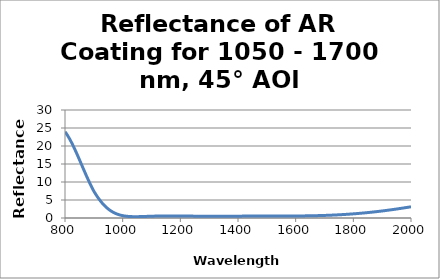
| Category | Reflectance (%) |
|---|---|
| 800.0 | 23.957 |
| 801.0 | 23.852 |
| 802.0 | 23.744 |
| 803.0 | 23.633 |
| 804.0 | 23.52 |
| 805.0 | 23.404 |
| 806.0 | 23.285 |
| 807.0 | 23.164 |
| 808.0 | 23.04 |
| 809.0 | 22.913 |
| 810.0 | 22.784 |
| 811.0 | 22.653 |
| 812.0 | 22.52 |
| 813.0 | 22.384 |
| 814.0 | 22.246 |
| 815.0 | 22.106 |
| 816.0 | 21.963 |
| 817.0 | 21.819 |
| 818.0 | 21.672 |
| 819.0 | 21.524 |
| 820.0 | 21.373 |
| 821.0 | 21.221 |
| 822.0 | 21.067 |
| 823.0 | 20.911 |
| 824.0 | 20.753 |
| 825.0 | 20.594 |
| 826.0 | 20.433 |
| 827.0 | 20.27 |
| 828.0 | 20.106 |
| 829.0 | 19.941 |
| 830.0 | 19.774 |
| 831.0 | 19.605 |
| 832.0 | 19.436 |
| 833.0 | 19.265 |
| 834.0 | 19.092 |
| 835.0 | 18.919 |
| 836.0 | 18.744 |
| 837.0 | 18.569 |
| 838.0 | 18.392 |
| 839.0 | 18.215 |
| 840.0 | 18.036 |
| 841.0 | 17.857 |
| 842.0 | 17.676 |
| 843.0 | 17.495 |
| 844.0 | 17.314 |
| 845.0 | 17.131 |
| 846.0 | 16.948 |
| 847.0 | 16.765 |
| 848.0 | 16.58 |
| 849.0 | 16.396 |
| 850.0 | 16.211 |
| 851.0 | 16.026 |
| 852.0 | 15.84 |
| 853.0 | 15.654 |
| 854.0 | 15.468 |
| 855.0 | 15.282 |
| 856.0 | 15.095 |
| 857.0 | 14.908 |
| 858.0 | 14.722 |
| 859.0 | 14.536 |
| 860.0 | 14.349 |
| 861.0 | 14.163 |
| 862.0 | 13.977 |
| 863.0 | 13.791 |
| 864.0 | 13.605 |
| 865.0 | 13.42 |
| 866.0 | 13.235 |
| 867.0 | 13.05 |
| 868.0 | 12.866 |
| 869.0 | 12.683 |
| 870.0 | 12.5 |
| 871.0 | 12.317 |
| 872.0 | 12.136 |
| 873.0 | 11.954 |
| 874.0 | 11.774 |
| 875.0 | 11.594 |
| 876.0 | 11.415 |
| 877.0 | 11.237 |
| 878.0 | 11.06 |
| 879.0 | 10.884 |
| 880.0 | 10.709 |
| 881.0 | 10.534 |
| 882.0 | 10.361 |
| 883.0 | 10.189 |
| 884.0 | 10.018 |
| 885.0 | 9.848 |
| 886.0 | 9.679 |
| 887.0 | 9.512 |
| 888.0 | 9.345 |
| 889.0 | 9.18 |
| 890.0 | 9.016 |
| 891.0 | 8.854 |
| 892.0 | 8.693 |
| 893.0 | 8.533 |
| 894.0 | 8.375 |
| 895.0 | 8.218 |
| 896.0 | 8.062 |
| 897.0 | 7.908 |
| 898.0 | 7.756 |
| 899.0 | 7.605 |
| 900.0 | 7.456 |
| 901.0 | 7.322 |
| 902.0 | 7.19 |
| 903.0 | 7.058 |
| 904.0 | 6.929 |
| 905.0 | 6.801 |
| 906.0 | 6.674 |
| 907.0 | 6.548 |
| 908.0 | 6.424 |
| 909.0 | 6.301 |
| 910.0 | 6.18 |
| 911.0 | 6.06 |
| 912.0 | 5.941 |
| 913.0 | 5.824 |
| 914.0 | 5.708 |
| 915.0 | 5.594 |
| 916.0 | 5.481 |
| 917.0 | 5.37 |
| 918.0 | 5.26 |
| 919.0 | 5.152 |
| 920.0 | 5.045 |
| 921.0 | 4.939 |
| 922.0 | 4.835 |
| 923.0 | 4.732 |
| 924.0 | 4.631 |
| 925.0 | 4.532 |
| 926.0 | 4.434 |
| 927.0 | 4.337 |
| 928.0 | 4.242 |
| 929.0 | 4.148 |
| 930.0 | 4.055 |
| 931.0 | 3.964 |
| 932.0 | 3.875 |
| 933.0 | 3.787 |
| 934.0 | 3.7 |
| 935.0 | 3.615 |
| 936.0 | 3.532 |
| 937.0 | 3.449 |
| 938.0 | 3.368 |
| 939.0 | 3.289 |
| 940.0 | 3.211 |
| 941.0 | 3.134 |
| 942.0 | 3.059 |
| 943.0 | 2.985 |
| 944.0 | 2.913 |
| 945.0 | 2.842 |
| 946.0 | 2.772 |
| 947.0 | 2.703 |
| 948.0 | 2.636 |
| 949.0 | 2.57 |
| 950.0 | 2.506 |
| 951.0 | 2.442 |
| 952.0 | 2.38 |
| 953.0 | 2.32 |
| 954.0 | 2.26 |
| 955.0 | 2.202 |
| 956.0 | 2.145 |
| 957.0 | 2.09 |
| 958.0 | 2.035 |
| 959.0 | 1.982 |
| 960.0 | 1.93 |
| 961.0 | 1.879 |
| 962.0 | 1.829 |
| 963.0 | 1.78 |
| 964.0 | 1.733 |
| 965.0 | 1.686 |
| 966.0 | 1.641 |
| 967.0 | 1.597 |
| 968.0 | 1.554 |
| 969.0 | 1.512 |
| 970.0 | 1.471 |
| 971.0 | 1.43 |
| 972.0 | 1.392 |
| 973.0 | 1.354 |
| 974.0 | 1.317 |
| 975.0 | 1.28 |
| 976.0 | 1.245 |
| 977.0 | 1.211 |
| 978.0 | 1.178 |
| 979.0 | 1.146 |
| 980.0 | 1.114 |
| 981.0 | 1.084 |
| 982.0 | 1.054 |
| 983.0 | 1.026 |
| 984.0 | 0.998 |
| 985.0 | 0.97 |
| 986.0 | 0.944 |
| 987.0 | 0.919 |
| 988.0 | 0.894 |
| 989.0 | 0.87 |
| 990.0 | 0.847 |
| 991.0 | 0.824 |
| 992.0 | 0.803 |
| 993.0 | 0.782 |
| 994.0 | 0.761 |
| 995.0 | 0.742 |
| 996.0 | 0.723 |
| 997.0 | 0.704 |
| 998.0 | 0.687 |
| 999.0 | 0.67 |
| 1000.0 | 0.653 |
| 1001.0 | 0.638 |
| 1002.0 | 0.622 |
| 1003.0 | 0.608 |
| 1004.0 | 0.594 |
| 1005.0 | 0.58 |
| 1006.0 | 0.567 |
| 1007.0 | 0.555 |
| 1008.0 | 0.543 |
| 1009.0 | 0.532 |
| 1010.0 | 0.521 |
| 1011.0 | 0.51 |
| 1012.0 | 0.5 |
| 1013.0 | 0.491 |
| 1014.0 | 0.482 |
| 1015.0 | 0.473 |
| 1016.0 | 0.465 |
| 1017.0 | 0.457 |
| 1018.0 | 0.45 |
| 1019.0 | 0.443 |
| 1020.0 | 0.436 |
| 1021.0 | 0.43 |
| 1022.0 | 0.425 |
| 1023.0 | 0.419 |
| 1024.0 | 0.414 |
| 1025.0 | 0.409 |
| 1026.0 | 0.405 |
| 1027.0 | 0.401 |
| 1028.0 | 0.397 |
| 1029.0 | 0.393 |
| 1030.0 | 0.39 |
| 1031.0 | 0.387 |
| 1032.0 | 0.384 |
| 1033.0 | 0.382 |
| 1034.0 | 0.38 |
| 1035.0 | 0.378 |
| 1036.0 | 0.376 |
| 1037.0 | 0.375 |
| 1038.0 | 0.374 |
| 1039.0 | 0.373 |
| 1040.0 | 0.372 |
| 1041.0 | 0.371 |
| 1042.0 | 0.371 |
| 1043.0 | 0.37 |
| 1044.0 | 0.37 |
| 1045.0 | 0.371 |
| 1046.0 | 0.371 |
| 1047.0 | 0.371 |
| 1048.0 | 0.372 |
| 1049.0 | 0.373 |
| 1050.0 | 0.374 |
| 1051.0 | 0.375 |
| 1052.0 | 0.376 |
| 1053.0 | 0.377 |
| 1054.0 | 0.378 |
| 1055.0 | 0.38 |
| 1056.0 | 0.381 |
| 1057.0 | 0.383 |
| 1058.0 | 0.385 |
| 1059.0 | 0.387 |
| 1060.0 | 0.389 |
| 1061.0 | 0.391 |
| 1062.0 | 0.393 |
| 1063.0 | 0.395 |
| 1064.0 | 0.397 |
| 1065.0 | 0.4 |
| 1066.0 | 0.402 |
| 1067.0 | 0.405 |
| 1068.0 | 0.407 |
| 1069.0 | 0.41 |
| 1070.0 | 0.412 |
| 1071.0 | 0.415 |
| 1072.0 | 0.417 |
| 1073.0 | 0.42 |
| 1074.0 | 0.423 |
| 1075.0 | 0.426 |
| 1076.0 | 0.428 |
| 1077.0 | 0.431 |
| 1078.0 | 0.434 |
| 1079.0 | 0.437 |
| 1080.0 | 0.44 |
| 1081.0 | 0.442 |
| 1082.0 | 0.445 |
| 1083.0 | 0.448 |
| 1084.0 | 0.451 |
| 1085.0 | 0.454 |
| 1086.0 | 0.457 |
| 1087.0 | 0.459 |
| 1088.0 | 0.462 |
| 1089.0 | 0.465 |
| 1090.0 | 0.468 |
| 1091.0 | 0.471 |
| 1092.0 | 0.473 |
| 1093.0 | 0.476 |
| 1094.0 | 0.479 |
| 1095.0 | 0.482 |
| 1096.0 | 0.484 |
| 1097.0 | 0.487 |
| 1098.0 | 0.49 |
| 1099.0 | 0.492 |
| 1100.0 | 0.495 |
| 1101.0 | 0.497 |
| 1102.0 | 0.5 |
| 1103.0 | 0.502 |
| 1104.0 | 0.505 |
| 1105.0 | 0.507 |
| 1106.0 | 0.51 |
| 1107.0 | 0.512 |
| 1108.0 | 0.514 |
| 1109.0 | 0.517 |
| 1110.0 | 0.519 |
| 1111.0 | 0.521 |
| 1112.0 | 0.523 |
| 1113.0 | 0.525 |
| 1114.0 | 0.528 |
| 1115.0 | 0.53 |
| 1116.0 | 0.532 |
| 1117.0 | 0.534 |
| 1118.0 | 0.535 |
| 1119.0 | 0.537 |
| 1120.0 | 0.539 |
| 1121.0 | 0.541 |
| 1122.0 | 0.543 |
| 1123.0 | 0.544 |
| 1124.0 | 0.546 |
| 1125.0 | 0.548 |
| 1126.0 | 0.549 |
| 1127.0 | 0.551 |
| 1128.0 | 0.552 |
| 1129.0 | 0.554 |
| 1130.0 | 0.555 |
| 1131.0 | 0.556 |
| 1132.0 | 0.558 |
| 1133.0 | 0.559 |
| 1134.0 | 0.56 |
| 1135.0 | 0.561 |
| 1136.0 | 0.562 |
| 1137.0 | 0.564 |
| 1138.0 | 0.564 |
| 1139.0 | 0.566 |
| 1140.0 | 0.566 |
| 1141.0 | 0.567 |
| 1142.0 | 0.568 |
| 1143.0 | 0.569 |
| 1144.0 | 0.57 |
| 1145.0 | 0.57 |
| 1146.0 | 0.571 |
| 1147.0 | 0.572 |
| 1148.0 | 0.572 |
| 1149.0 | 0.573 |
| 1150.0 | 0.574 |
| 1151.0 | 0.574 |
| 1152.0 | 0.574 |
| 1153.0 | 0.575 |
| 1154.0 | 0.575 |
| 1155.0 | 0.576 |
| 1156.0 | 0.576 |
| 1157.0 | 0.576 |
| 1158.0 | 0.576 |
| 1159.0 | 0.577 |
| 1160.0 | 0.577 |
| 1161.0 | 0.577 |
| 1162.0 | 0.577 |
| 1163.0 | 0.577 |
| 1164.0 | 0.577 |
| 1165.0 | 0.577 |
| 1166.0 | 0.577 |
| 1167.0 | 0.577 |
| 1168.0 | 0.577 |
| 1169.0 | 0.577 |
| 1170.0 | 0.576 |
| 1171.0 | 0.576 |
| 1172.0 | 0.576 |
| 1173.0 | 0.576 |
| 1174.0 | 0.576 |
| 1175.0 | 0.575 |
| 1176.0 | 0.575 |
| 1177.0 | 0.574 |
| 1178.0 | 0.574 |
| 1179.0 | 0.574 |
| 1180.0 | 0.573 |
| 1181.0 | 0.573 |
| 1182.0 | 0.572 |
| 1183.0 | 0.572 |
| 1184.0 | 0.571 |
| 1185.0 | 0.571 |
| 1186.0 | 0.57 |
| 1187.0 | 0.57 |
| 1188.0 | 0.569 |
| 1189.0 | 0.568 |
| 1190.0 | 0.568 |
| 1191.0 | 0.567 |
| 1192.0 | 0.566 |
| 1193.0 | 0.566 |
| 1194.0 | 0.565 |
| 1195.0 | 0.564 |
| 1196.0 | 0.564 |
| 1197.0 | 0.563 |
| 1198.0 | 0.562 |
| 1199.0 | 0.561 |
| 1200.0 | 0.56 |
| 1201.0 | 0.56 |
| 1202.0 | 0.559 |
| 1203.0 | 0.558 |
| 1204.0 | 0.557 |
| 1205.0 | 0.556 |
| 1206.0 | 0.556 |
| 1207.0 | 0.555 |
| 1208.0 | 0.554 |
| 1209.0 | 0.553 |
| 1210.0 | 0.552 |
| 1211.0 | 0.551 |
| 1212.0 | 0.55 |
| 1213.0 | 0.549 |
| 1214.0 | 0.548 |
| 1215.0 | 0.548 |
| 1216.0 | 0.547 |
| 1217.0 | 0.546 |
| 1218.0 | 0.545 |
| 1219.0 | 0.544 |
| 1220.0 | 0.543 |
| 1221.0 | 0.542 |
| 1222.0 | 0.541 |
| 1223.0 | 0.54 |
| 1224.0 | 0.539 |
| 1225.0 | 0.538 |
| 1226.0 | 0.538 |
| 1227.0 | 0.537 |
| 1228.0 | 0.536 |
| 1229.0 | 0.535 |
| 1230.0 | 0.534 |
| 1231.0 | 0.533 |
| 1232.0 | 0.532 |
| 1233.0 | 0.531 |
| 1234.0 | 0.53 |
| 1235.0 | 0.529 |
| 1236.0 | 0.528 |
| 1237.0 | 0.528 |
| 1238.0 | 0.527 |
| 1239.0 | 0.526 |
| 1240.0 | 0.525 |
| 1241.0 | 0.524 |
| 1242.0 | 0.523 |
| 1243.0 | 0.522 |
| 1244.0 | 0.522 |
| 1245.0 | 0.521 |
| 1246.0 | 0.52 |
| 1247.0 | 0.519 |
| 1248.0 | 0.518 |
| 1249.0 | 0.518 |
| 1250.0 | 0.517 |
| 1251.0 | 0.516 |
| 1252.0 | 0.515 |
| 1253.0 | 0.514 |
| 1254.0 | 0.514 |
| 1255.0 | 0.513 |
| 1256.0 | 0.512 |
| 1257.0 | 0.511 |
| 1258.0 | 0.511 |
| 1259.0 | 0.51 |
| 1260.0 | 0.509 |
| 1261.0 | 0.509 |
| 1262.0 | 0.508 |
| 1263.0 | 0.507 |
| 1264.0 | 0.507 |
| 1265.0 | 0.506 |
| 1266.0 | 0.505 |
| 1267.0 | 0.505 |
| 1268.0 | 0.504 |
| 1269.0 | 0.503 |
| 1270.0 | 0.503 |
| 1271.0 | 0.502 |
| 1272.0 | 0.502 |
| 1273.0 | 0.501 |
| 1274.0 | 0.501 |
| 1275.0 | 0.5 |
| 1276.0 | 0.5 |
| 1277.0 | 0.499 |
| 1278.0 | 0.499 |
| 1279.0 | 0.498 |
| 1280.0 | 0.498 |
| 1281.0 | 0.497 |
| 1282.0 | 0.497 |
| 1283.0 | 0.497 |
| 1284.0 | 0.496 |
| 1285.0 | 0.496 |
| 1286.0 | 0.495 |
| 1287.0 | 0.495 |
| 1288.0 | 0.495 |
| 1289.0 | 0.494 |
| 1290.0 | 0.494 |
| 1291.0 | 0.494 |
| 1292.0 | 0.494 |
| 1293.0 | 0.493 |
| 1294.0 | 0.493 |
| 1295.0 | 0.493 |
| 1296.0 | 0.492 |
| 1297.0 | 0.492 |
| 1298.0 | 0.492 |
| 1299.0 | 0.492 |
| 1300.0 | 0.492 |
| 1301.0 | 0.492 |
| 1302.0 | 0.491 |
| 1303.0 | 0.491 |
| 1304.0 | 0.491 |
| 1305.0 | 0.491 |
| 1306.0 | 0.491 |
| 1307.0 | 0.491 |
| 1308.0 | 0.491 |
| 1309.0 | 0.491 |
| 1310.0 | 0.491 |
| 1311.0 | 0.491 |
| 1312.0 | 0.491 |
| 1313.0 | 0.491 |
| 1314.0 | 0.491 |
| 1315.0 | 0.491 |
| 1316.0 | 0.491 |
| 1317.0 | 0.491 |
| 1318.0 | 0.491 |
| 1319.0 | 0.491 |
| 1320.0 | 0.491 |
| 1321.0 | 0.491 |
| 1322.0 | 0.491 |
| 1323.0 | 0.492 |
| 1324.0 | 0.492 |
| 1325.0 | 0.492 |
| 1326.0 | 0.492 |
| 1327.0 | 0.492 |
| 1328.0 | 0.492 |
| 1329.0 | 0.492 |
| 1330.0 | 0.492 |
| 1331.0 | 0.493 |
| 1332.0 | 0.493 |
| 1333.0 | 0.493 |
| 1334.0 | 0.493 |
| 1335.0 | 0.493 |
| 1336.0 | 0.494 |
| 1337.0 | 0.494 |
| 1338.0 | 0.494 |
| 1339.0 | 0.494 |
| 1340.0 | 0.494 |
| 1341.0 | 0.495 |
| 1342.0 | 0.495 |
| 1343.0 | 0.495 |
| 1344.0 | 0.495 |
| 1345.0 | 0.496 |
| 1346.0 | 0.496 |
| 1347.0 | 0.496 |
| 1348.0 | 0.496 |
| 1349.0 | 0.497 |
| 1350.0 | 0.497 |
| 1351.0 | 0.497 |
| 1352.0 | 0.498 |
| 1353.0 | 0.498 |
| 1354.0 | 0.498 |
| 1355.0 | 0.499 |
| 1356.0 | 0.499 |
| 1357.0 | 0.499 |
| 1358.0 | 0.5 |
| 1359.0 | 0.5 |
| 1360.0 | 0.5 |
| 1361.0 | 0.501 |
| 1362.0 | 0.501 |
| 1363.0 | 0.501 |
| 1364.0 | 0.502 |
| 1365.0 | 0.502 |
| 1366.0 | 0.502 |
| 1367.0 | 0.503 |
| 1368.0 | 0.503 |
| 1369.0 | 0.503 |
| 1370.0 | 0.504 |
| 1371.0 | 0.504 |
| 1372.0 | 0.504 |
| 1373.0 | 0.505 |
| 1374.0 | 0.505 |
| 1375.0 | 0.506 |
| 1376.0 | 0.506 |
| 1377.0 | 0.506 |
| 1378.0 | 0.507 |
| 1379.0 | 0.507 |
| 1380.0 | 0.508 |
| 1381.0 | 0.508 |
| 1382.0 | 0.508 |
| 1383.0 | 0.509 |
| 1384.0 | 0.509 |
| 1385.0 | 0.51 |
| 1386.0 | 0.51 |
| 1387.0 | 0.51 |
| 1388.0 | 0.511 |
| 1389.0 | 0.511 |
| 1390.0 | 0.511 |
| 1391.0 | 0.512 |
| 1392.0 | 0.512 |
| 1393.0 | 0.513 |
| 1394.0 | 0.513 |
| 1395.0 | 0.514 |
| 1396.0 | 0.514 |
| 1397.0 | 0.514 |
| 1398.0 | 0.515 |
| 1399.0 | 0.515 |
| 1400.0 | 0.515 |
| 1401.0 | 0.516 |
| 1402.0 | 0.516 |
| 1403.0 | 0.517 |
| 1404.0 | 0.517 |
| 1405.0 | 0.517 |
| 1406.0 | 0.518 |
| 1407.0 | 0.518 |
| 1408.0 | 0.518 |
| 1409.0 | 0.519 |
| 1410.0 | 0.519 |
| 1411.0 | 0.52 |
| 1412.0 | 0.52 |
| 1413.0 | 0.52 |
| 1414.0 | 0.521 |
| 1415.0 | 0.521 |
| 1416.0 | 0.521 |
| 1417.0 | 0.522 |
| 1418.0 | 0.522 |
| 1419.0 | 0.522 |
| 1420.0 | 0.523 |
| 1421.0 | 0.523 |
| 1422.0 | 0.524 |
| 1423.0 | 0.524 |
| 1424.0 | 0.524 |
| 1425.0 | 0.524 |
| 1426.0 | 0.525 |
| 1427.0 | 0.525 |
| 1428.0 | 0.526 |
| 1429.0 | 0.526 |
| 1430.0 | 0.526 |
| 1431.0 | 0.526 |
| 1432.0 | 0.527 |
| 1433.0 | 0.527 |
| 1434.0 | 0.527 |
| 1435.0 | 0.528 |
| 1436.0 | 0.528 |
| 1437.0 | 0.528 |
| 1438.0 | 0.529 |
| 1439.0 | 0.529 |
| 1440.0 | 0.529 |
| 1441.0 | 0.53 |
| 1442.0 | 0.53 |
| 1443.0 | 0.53 |
| 1444.0 | 0.53 |
| 1445.0 | 0.53 |
| 1446.0 | 0.531 |
| 1447.0 | 0.531 |
| 1448.0 | 0.531 |
| 1449.0 | 0.532 |
| 1450.0 | 0.532 |
| 1451.0 | 0.532 |
| 1452.0 | 0.532 |
| 1453.0 | 0.533 |
| 1454.0 | 0.533 |
| 1455.0 | 0.533 |
| 1456.0 | 0.533 |
| 1457.0 | 0.534 |
| 1458.0 | 0.534 |
| 1459.0 | 0.534 |
| 1460.0 | 0.534 |
| 1461.0 | 0.534 |
| 1462.0 | 0.534 |
| 1463.0 | 0.535 |
| 1464.0 | 0.535 |
| 1465.0 | 0.535 |
| 1466.0 | 0.535 |
| 1467.0 | 0.536 |
| 1468.0 | 0.536 |
| 1469.0 | 0.536 |
| 1470.0 | 0.536 |
| 1471.0 | 0.536 |
| 1472.0 | 0.536 |
| 1473.0 | 0.537 |
| 1474.0 | 0.537 |
| 1475.0 | 0.537 |
| 1476.0 | 0.537 |
| 1477.0 | 0.537 |
| 1478.0 | 0.537 |
| 1479.0 | 0.538 |
| 1480.0 | 0.538 |
| 1481.0 | 0.538 |
| 1482.0 | 0.538 |
| 1483.0 | 0.538 |
| 1484.0 | 0.538 |
| 1485.0 | 0.538 |
| 1486.0 | 0.538 |
| 1487.0 | 0.539 |
| 1488.0 | 0.539 |
| 1489.0 | 0.539 |
| 1490.0 | 0.539 |
| 1491.0 | 0.539 |
| 1492.0 | 0.539 |
| 1493.0 | 0.539 |
| 1494.0 | 0.539 |
| 1495.0 | 0.54 |
| 1496.0 | 0.54 |
| 1497.0 | 0.54 |
| 1498.0 | 0.54 |
| 1499.0 | 0.54 |
| 1500.0 | 0.54 |
| 1501.0 | 0.54 |
| 1502.0 | 0.54 |
| 1503.0 | 0.54 |
| 1504.0 | 0.54 |
| 1505.0 | 0.54 |
| 1506.0 | 0.541 |
| 1507.0 | 0.541 |
| 1508.0 | 0.541 |
| 1509.0 | 0.541 |
| 1510.0 | 0.541 |
| 1511.0 | 0.541 |
| 1512.0 | 0.541 |
| 1513.0 | 0.541 |
| 1514.0 | 0.541 |
| 1515.0 | 0.542 |
| 1516.0 | 0.542 |
| 1517.0 | 0.542 |
| 1518.0 | 0.542 |
| 1519.0 | 0.542 |
| 1520.0 | 0.542 |
| 1521.0 | 0.542 |
| 1522.0 | 0.542 |
| 1523.0 | 0.542 |
| 1524.0 | 0.542 |
| 1525.0 | 0.542 |
| 1526.0 | 0.542 |
| 1527.0 | 0.543 |
| 1528.0 | 0.543 |
| 1529.0 | 0.543 |
| 1530.0 | 0.543 |
| 1531.0 | 0.543 |
| 1532.0 | 0.543 |
| 1533.0 | 0.543 |
| 1534.0 | 0.543 |
| 1535.0 | 0.543 |
| 1536.0 | 0.544 |
| 1537.0 | 0.544 |
| 1538.0 | 0.544 |
| 1539.0 | 0.544 |
| 1540.0 | 0.544 |
| 1541.0 | 0.544 |
| 1542.0 | 0.544 |
| 1543.0 | 0.544 |
| 1544.0 | 0.544 |
| 1545.0 | 0.545 |
| 1546.0 | 0.545 |
| 1547.0 | 0.545 |
| 1548.0 | 0.545 |
| 1549.0 | 0.545 |
| 1550.0 | 0.546 |
| 1551.0 | 0.546 |
| 1552.0 | 0.546 |
| 1553.0 | 0.546 |
| 1554.0 | 0.546 |
| 1555.0 | 0.546 |
| 1556.0 | 0.547 |
| 1557.0 | 0.547 |
| 1558.0 | 0.547 |
| 1559.0 | 0.547 |
| 1560.0 | 0.547 |
| 1561.0 | 0.548 |
| 1562.0 | 0.548 |
| 1563.0 | 0.548 |
| 1564.0 | 0.548 |
| 1565.0 | 0.549 |
| 1566.0 | 0.549 |
| 1567.0 | 0.549 |
| 1568.0 | 0.549 |
| 1569.0 | 0.55 |
| 1570.0 | 0.55 |
| 1571.0 | 0.55 |
| 1572.0 | 0.55 |
| 1573.0 | 0.551 |
| 1574.0 | 0.551 |
| 1575.0 | 0.552 |
| 1576.0 | 0.552 |
| 1577.0 | 0.552 |
| 1578.0 | 0.552 |
| 1579.0 | 0.553 |
| 1580.0 | 0.553 |
| 1581.0 | 0.554 |
| 1582.0 | 0.554 |
| 1583.0 | 0.554 |
| 1584.0 | 0.555 |
| 1585.0 | 0.555 |
| 1586.0 | 0.556 |
| 1587.0 | 0.556 |
| 1588.0 | 0.557 |
| 1589.0 | 0.557 |
| 1590.0 | 0.558 |
| 1591.0 | 0.558 |
| 1592.0 | 0.558 |
| 1593.0 | 0.559 |
| 1594.0 | 0.56 |
| 1595.0 | 0.56 |
| 1596.0 | 0.561 |
| 1597.0 | 0.561 |
| 1598.0 | 0.562 |
| 1599.0 | 0.562 |
| 1600.0 | 0.563 |
| 1601.0 | 0.564 |
| 1602.0 | 0.564 |
| 1603.0 | 0.565 |
| 1604.0 | 0.565 |
| 1605.0 | 0.566 |
| 1606.0 | 0.567 |
| 1607.0 | 0.567 |
| 1608.0 | 0.568 |
| 1609.0 | 0.569 |
| 1610.0 | 0.57 |
| 1611.0 | 0.57 |
| 1612.0 | 0.571 |
| 1613.0 | 0.572 |
| 1614.0 | 0.573 |
| 1615.0 | 0.573 |
| 1616.0 | 0.574 |
| 1617.0 | 0.575 |
| 1618.0 | 0.576 |
| 1619.0 | 0.577 |
| 1620.0 | 0.578 |
| 1621.0 | 0.578 |
| 1622.0 | 0.58 |
| 1623.0 | 0.58 |
| 1624.0 | 0.581 |
| 1625.0 | 0.582 |
| 1626.0 | 0.583 |
| 1627.0 | 0.584 |
| 1628.0 | 0.585 |
| 1629.0 | 0.586 |
| 1630.0 | 0.587 |
| 1631.0 | 0.588 |
| 1632.0 | 0.59 |
| 1633.0 | 0.591 |
| 1634.0 | 0.592 |
| 1635.0 | 0.593 |
| 1636.0 | 0.594 |
| 1637.0 | 0.595 |
| 1638.0 | 0.596 |
| 1639.0 | 0.598 |
| 1640.0 | 0.599 |
| 1641.0 | 0.6 |
| 1642.0 | 0.602 |
| 1643.0 | 0.603 |
| 1644.0 | 0.604 |
| 1645.0 | 0.605 |
| 1646.0 | 0.607 |
| 1647.0 | 0.608 |
| 1648.0 | 0.61 |
| 1649.0 | 0.611 |
| 1650.0 | 0.612 |
| 1651.0 | 0.614 |
| 1652.0 | 0.615 |
| 1653.0 | 0.617 |
| 1654.0 | 0.618 |
| 1655.0 | 0.62 |
| 1656.0 | 0.622 |
| 1657.0 | 0.623 |
| 1658.0 | 0.625 |
| 1659.0 | 0.626 |
| 1660.0 | 0.628 |
| 1661.0 | 0.63 |
| 1662.0 | 0.632 |
| 1663.0 | 0.633 |
| 1664.0 | 0.635 |
| 1665.0 | 0.637 |
| 1666.0 | 0.639 |
| 1667.0 | 0.64 |
| 1668.0 | 0.642 |
| 1669.0 | 0.644 |
| 1670.0 | 0.646 |
| 1671.0 | 0.648 |
| 1672.0 | 0.65 |
| 1673.0 | 0.652 |
| 1674.0 | 0.654 |
| 1675.0 | 0.656 |
| 1676.0 | 0.658 |
| 1677.0 | 0.66 |
| 1678.0 | 0.662 |
| 1679.0 | 0.664 |
| 1680.0 | 0.666 |
| 1681.0 | 0.669 |
| 1682.0 | 0.671 |
| 1683.0 | 0.673 |
| 1684.0 | 0.675 |
| 1685.0 | 0.678 |
| 1686.0 | 0.68 |
| 1687.0 | 0.682 |
| 1688.0 | 0.685 |
| 1689.0 | 0.687 |
| 1690.0 | 0.69 |
| 1691.0 | 0.692 |
| 1692.0 | 0.694 |
| 1693.0 | 0.697 |
| 1694.0 | 0.7 |
| 1695.0 | 0.702 |
| 1696.0 | 0.705 |
| 1697.0 | 0.707 |
| 1698.0 | 0.71 |
| 1699.0 | 0.713 |
| 1700.0 | 0.715 |
| 1701.0 | 0.718 |
| 1702.0 | 0.721 |
| 1703.0 | 0.724 |
| 1704.0 | 0.726 |
| 1705.0 | 0.729 |
| 1706.0 | 0.732 |
| 1707.0 | 0.735 |
| 1708.0 | 0.738 |
| 1709.0 | 0.741 |
| 1710.0 | 0.744 |
| 1711.0 | 0.747 |
| 1712.0 | 0.75 |
| 1713.0 | 0.753 |
| 1714.0 | 0.756 |
| 1715.0 | 0.76 |
| 1716.0 | 0.763 |
| 1717.0 | 0.766 |
| 1718.0 | 0.769 |
| 1719.0 | 0.772 |
| 1720.0 | 0.776 |
| 1721.0 | 0.779 |
| 1722.0 | 0.782 |
| 1723.0 | 0.786 |
| 1724.0 | 0.789 |
| 1725.0 | 0.793 |
| 1726.0 | 0.796 |
| 1727.0 | 0.8 |
| 1728.0 | 0.804 |
| 1729.0 | 0.807 |
| 1730.0 | 0.811 |
| 1731.0 | 0.814 |
| 1732.0 | 0.818 |
| 1733.0 | 0.822 |
| 1734.0 | 0.826 |
| 1735.0 | 0.829 |
| 1736.0 | 0.833 |
| 1737.0 | 0.837 |
| 1738.0 | 0.841 |
| 1739.0 | 0.845 |
| 1740.0 | 0.849 |
| 1741.0 | 0.853 |
| 1742.0 | 0.857 |
| 1743.0 | 0.861 |
| 1744.0 | 0.865 |
| 1745.0 | 0.869 |
| 1746.0 | 0.873 |
| 1747.0 | 0.878 |
| 1748.0 | 0.882 |
| 1749.0 | 0.886 |
| 1750.0 | 0.89 |
| 1751.0 | 0.895 |
| 1752.0 | 0.899 |
| 1753.0 | 0.904 |
| 1754.0 | 0.908 |
| 1755.0 | 0.912 |
| 1756.0 | 0.917 |
| 1757.0 | 0.921 |
| 1758.0 | 0.926 |
| 1759.0 | 0.931 |
| 1760.0 | 0.935 |
| 1761.0 | 0.94 |
| 1762.0 | 0.945 |
| 1763.0 | 0.95 |
| 1764.0 | 0.954 |
| 1765.0 | 0.959 |
| 1766.0 | 0.964 |
| 1767.0 | 0.969 |
| 1768.0 | 0.974 |
| 1769.0 | 0.979 |
| 1770.0 | 0.984 |
| 1771.0 | 0.989 |
| 1772.0 | 0.994 |
| 1773.0 | 0.999 |
| 1774.0 | 1.004 |
| 1775.0 | 1.009 |
| 1776.0 | 1.015 |
| 1777.0 | 1.02 |
| 1778.0 | 1.025 |
| 1779.0 | 1.03 |
| 1780.0 | 1.036 |
| 1781.0 | 1.041 |
| 1782.0 | 1.047 |
| 1783.0 | 1.052 |
| 1784.0 | 1.058 |
| 1785.0 | 1.063 |
| 1786.0 | 1.069 |
| 1787.0 | 1.074 |
| 1788.0 | 1.08 |
| 1789.0 | 1.086 |
| 1790.0 | 1.092 |
| 1791.0 | 1.097 |
| 1792.0 | 1.103 |
| 1793.0 | 1.109 |
| 1794.0 | 1.115 |
| 1795.0 | 1.121 |
| 1796.0 | 1.127 |
| 1797.0 | 1.133 |
| 1798.0 | 1.139 |
| 1799.0 | 1.145 |
| 1800.0 | 1.151 |
| 1801.0 | 1.157 |
| 1802.0 | 1.164 |
| 1803.0 | 1.17 |
| 1804.0 | 1.176 |
| 1805.0 | 1.182 |
| 1806.0 | 1.189 |
| 1807.0 | 1.195 |
| 1808.0 | 1.202 |
| 1809.0 | 1.208 |
| 1810.0 | 1.214 |
| 1811.0 | 1.221 |
| 1812.0 | 1.228 |
| 1813.0 | 1.234 |
| 1814.0 | 1.241 |
| 1815.0 | 1.248 |
| 1816.0 | 1.254 |
| 1817.0 | 1.261 |
| 1818.0 | 1.268 |
| 1819.0 | 1.275 |
| 1820.0 | 1.282 |
| 1821.0 | 1.288 |
| 1822.0 | 1.295 |
| 1823.0 | 1.302 |
| 1824.0 | 1.309 |
| 1825.0 | 1.316 |
| 1826.0 | 1.324 |
| 1827.0 | 1.331 |
| 1828.0 | 1.338 |
| 1829.0 | 1.345 |
| 1830.0 | 1.352 |
| 1831.0 | 1.36 |
| 1832.0 | 1.367 |
| 1833.0 | 1.374 |
| 1834.0 | 1.382 |
| 1835.0 | 1.389 |
| 1836.0 | 1.397 |
| 1837.0 | 1.404 |
| 1838.0 | 1.412 |
| 1839.0 | 1.419 |
| 1840.0 | 1.427 |
| 1841.0 | 1.435 |
| 1842.0 | 1.442 |
| 1843.0 | 1.45 |
| 1844.0 | 1.458 |
| 1845.0 | 1.466 |
| 1846.0 | 1.474 |
| 1847.0 | 1.482 |
| 1848.0 | 1.49 |
| 1849.0 | 1.498 |
| 1850.0 | 1.506 |
| 1851.0 | 1.514 |
| 1852.0 | 1.522 |
| 1853.0 | 1.53 |
| 1854.0 | 1.538 |
| 1855.0 | 1.546 |
| 1856.0 | 1.554 |
| 1857.0 | 1.563 |
| 1858.0 | 1.571 |
| 1859.0 | 1.58 |
| 1860.0 | 1.588 |
| 1861.0 | 1.596 |
| 1862.0 | 1.605 |
| 1863.0 | 1.613 |
| 1864.0 | 1.622 |
| 1865.0 | 1.631 |
| 1866.0 | 1.639 |
| 1867.0 | 1.648 |
| 1868.0 | 1.657 |
| 1869.0 | 1.665 |
| 1870.0 | 1.674 |
| 1871.0 | 1.683 |
| 1872.0 | 1.692 |
| 1873.0 | 1.701 |
| 1874.0 | 1.71 |
| 1875.0 | 1.719 |
| 1876.0 | 1.728 |
| 1877.0 | 1.737 |
| 1878.0 | 1.746 |
| 1879.0 | 1.755 |
| 1880.0 | 1.764 |
| 1881.0 | 1.773 |
| 1882.0 | 1.782 |
| 1883.0 | 1.792 |
| 1884.0 | 1.801 |
| 1885.0 | 1.81 |
| 1886.0 | 1.82 |
| 1887.0 | 1.829 |
| 1888.0 | 1.839 |
| 1889.0 | 1.848 |
| 1890.0 | 1.858 |
| 1891.0 | 1.867 |
| 1892.0 | 1.877 |
| 1893.0 | 1.887 |
| 1894.0 | 1.896 |
| 1895.0 | 1.906 |
| 1896.0 | 1.916 |
| 1897.0 | 1.926 |
| 1898.0 | 1.935 |
| 1899.0 | 1.945 |
| 1900.0 | 1.955 |
| 1901.0 | 1.965 |
| 1902.0 | 1.975 |
| 1903.0 | 1.985 |
| 1904.0 | 1.995 |
| 1905.0 | 2.005 |
| 1906.0 | 2.015 |
| 1907.0 | 2.026 |
| 1908.0 | 2.036 |
| 1909.0 | 2.046 |
| 1910.0 | 2.056 |
| 1911.0 | 2.066 |
| 1912.0 | 2.077 |
| 1913.0 | 2.087 |
| 1914.0 | 2.098 |
| 1915.0 | 2.108 |
| 1916.0 | 2.118 |
| 1917.0 | 2.129 |
| 1918.0 | 2.14 |
| 1919.0 | 2.15 |
| 1920.0 | 2.161 |
| 1921.0 | 2.172 |
| 1922.0 | 2.182 |
| 1923.0 | 2.193 |
| 1924.0 | 2.204 |
| 1925.0 | 2.214 |
| 1926.0 | 2.225 |
| 1927.0 | 2.236 |
| 1928.0 | 2.247 |
| 1929.0 | 2.258 |
| 1930.0 | 2.269 |
| 1931.0 | 2.28 |
| 1932.0 | 2.291 |
| 1933.0 | 2.302 |
| 1934.0 | 2.313 |
| 1935.0 | 2.324 |
| 1936.0 | 2.336 |
| 1937.0 | 2.347 |
| 1938.0 | 2.358 |
| 1939.0 | 2.369 |
| 1940.0 | 2.381 |
| 1941.0 | 2.392 |
| 1942.0 | 2.403 |
| 1943.0 | 2.415 |
| 1944.0 | 2.426 |
| 1945.0 | 2.438 |
| 1946.0 | 2.449 |
| 1947.0 | 2.461 |
| 1948.0 | 2.472 |
| 1949.0 | 2.484 |
| 1950.0 | 2.496 |
| 1951.0 | 2.507 |
| 1952.0 | 2.519 |
| 1953.0 | 2.531 |
| 1954.0 | 2.543 |
| 1955.0 | 2.554 |
| 1956.0 | 2.566 |
| 1957.0 | 2.578 |
| 1958.0 | 2.59 |
| 1959.0 | 2.602 |
| 1960.0 | 2.614 |
| 1961.0 | 2.626 |
| 1962.0 | 2.638 |
| 1963.0 | 2.65 |
| 1964.0 | 2.662 |
| 1965.0 | 2.674 |
| 1966.0 | 2.687 |
| 1967.0 | 2.699 |
| 1968.0 | 2.711 |
| 1969.0 | 2.723 |
| 1970.0 | 2.736 |
| 1971.0 | 2.748 |
| 1972.0 | 2.76 |
| 1973.0 | 2.773 |
| 1974.0 | 2.785 |
| 1975.0 | 2.798 |
| 1976.0 | 2.81 |
| 1977.0 | 2.822 |
| 1978.0 | 2.835 |
| 1979.0 | 2.848 |
| 1980.0 | 2.86 |
| 1981.0 | 2.873 |
| 1982.0 | 2.886 |
| 1983.0 | 2.898 |
| 1984.0 | 2.911 |
| 1985.0 | 2.924 |
| 1986.0 | 2.936 |
| 1987.0 | 2.949 |
| 1988.0 | 2.962 |
| 1989.0 | 2.975 |
| 1990.0 | 2.988 |
| 1991.0 | 3.001 |
| 1992.0 | 3.014 |
| 1993.0 | 3.027 |
| 1994.0 | 3.04 |
| 1995.0 | 3.053 |
| 1996.0 | 3.066 |
| 1997.0 | 3.079 |
| 1998.0 | 3.092 |
| 1999.0 | 3.105 |
| 2000.0 | 3.118 |